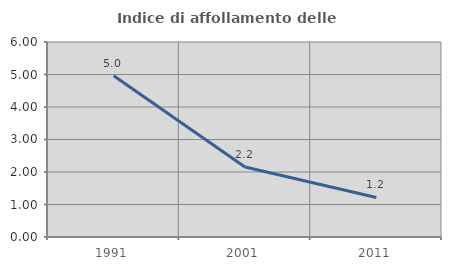
| Category | Indice di affollamento delle abitazioni  |
|---|---|
| 1991.0 | 4.96 |
| 2001.0 | 2.152 |
| 2011.0 | 1.218 |